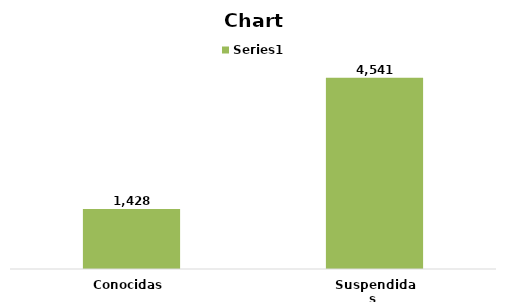
| Category | Series 0 |
|---|---|
| Conocidas  | 0.239 |
| Suspendidas  | 0.761 |